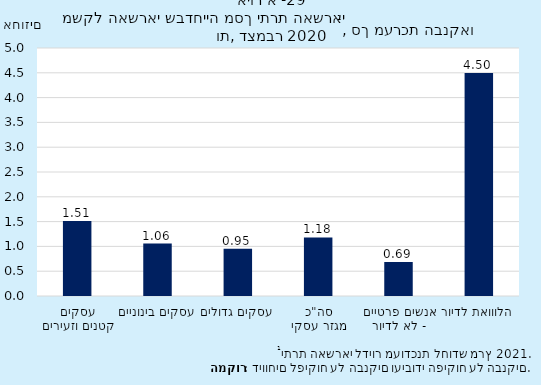
| Category | משקל |
|---|---|
| עסקים קטנים וזעירים | 1.514 |
| עסקים בינוניים | 1.058 |
| עסקים גדולים | 0.952 |
| סה"כ מגזר עסקי | 1.18 |
| אנשים פרטיים - לא לדיור | 0.686 |
| הלווואת לדיור | 4.498 |